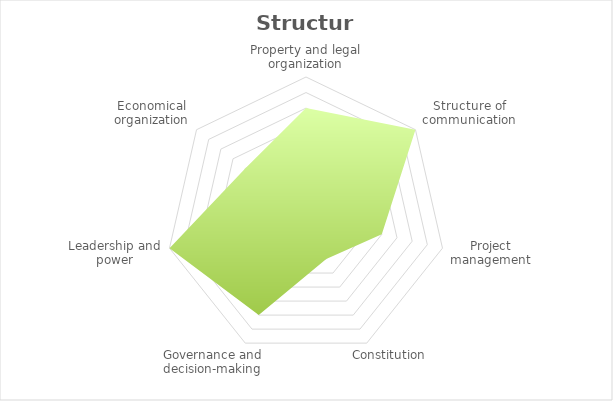
| Category | Series 0 |
|---|---|
| Property and legal organization | 3.5 |
| Structure of communication | 4.5 |
| Project management | 2.5 |
| Constitution | 1.5 |
| Governance and decision-making | 3.5 |
| Leadership and power | 4.5 |
| Economical organization | 2.5 |